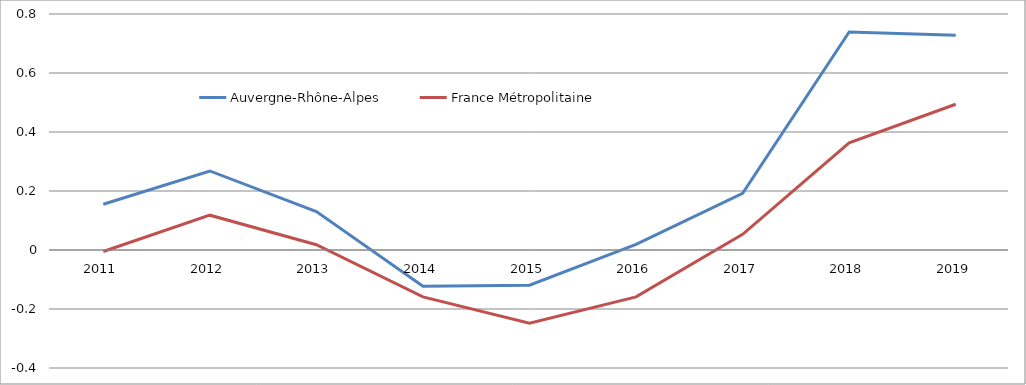
| Category | Auvergne-Rhône-Alpes | France Métropolitaine |
|---|---|---|
| 2011 | 0.155 | -0.005 |
| 2012 | 0.268 | 0.118 |
| 2013 | 0.131 | 0.018 |
| 2014 | -0.123 | -0.159 |
| 2015 | -0.12 | -0.248 |
| 2016 | 0.019 | -0.159 |
| 2017 | 0.192 | 0.053 |
| 2018 | 0.739 | 0.363 |
| 2019 | 0.728 | 0.494 |